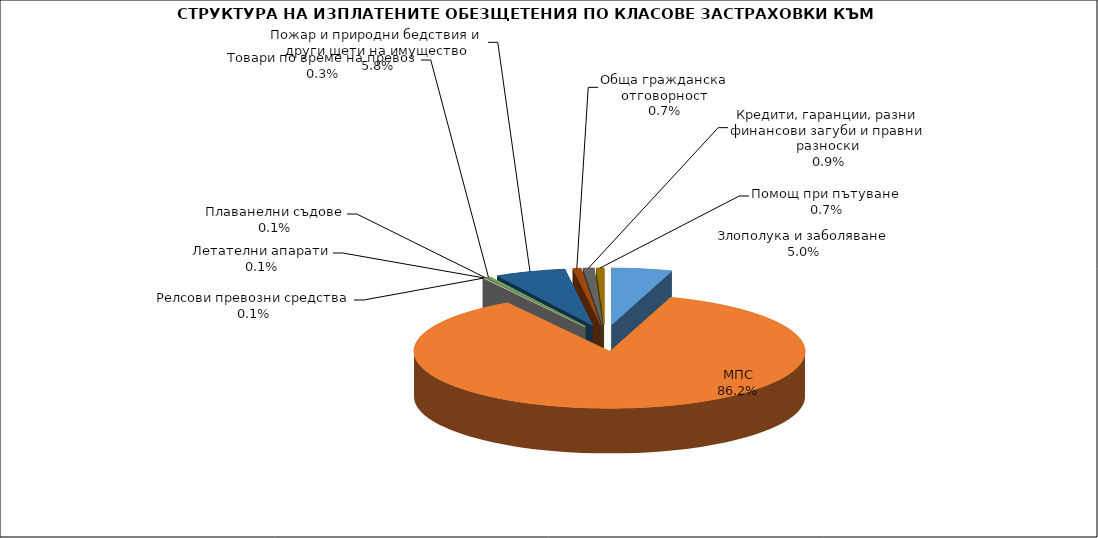
| Category | Series 0 |
|---|---|
| Злополука и заболяване | 0.05 |
| МПС | 0.862 |
| Релсови превозни средства | 0.001 |
| Летателни апарати | 0.001 |
| Плаванелни съдове | 0.001 |
| Товари по време на превоз | 0.003 |
| Пожар и природни бедствия и други щети на имущество | 0.058 |
| Обща гражданска отговорност | 0.007 |
| Кредити, гаранции, разни финансови загуби и правни разноски | 0.009 |
| Помощ при пътуване | 0.007 |